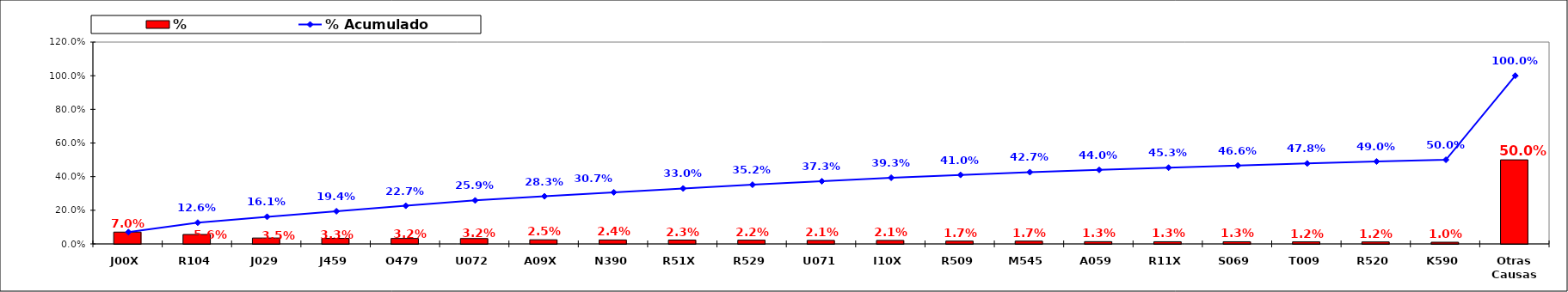
| Category | % |
|---|---|
| J00X | 0.07 |
| R104 | 0.056 |
| J029 | 0.035 |
| J459 | 0.033 |
| O479 | 0.032 |
| U072 | 0.032 |
| A09X | 0.025 |
| N390 | 0.024 |
| R51X | 0.023 |
| R529 | 0.022 |
| U071 | 0.021 |
| I10X | 0.021 |
| R509 | 0.017 |
| M545 | 0.017 |
| A059 | 0.013 |
| R11X | 0.013 |
| S069 | 0.013 |
| T009 | 0.012 |
| R520 | 0.012 |
| K590 | 0.01 |
| Otras Causas | 0.5 |